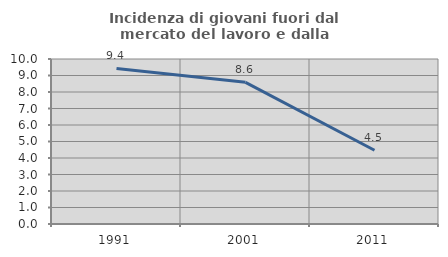
| Category | Incidenza di giovani fuori dal mercato del lavoro e dalla formazione  |
|---|---|
| 1991.0 | 9.426 |
| 2001.0 | 8.586 |
| 2011.0 | 4.469 |